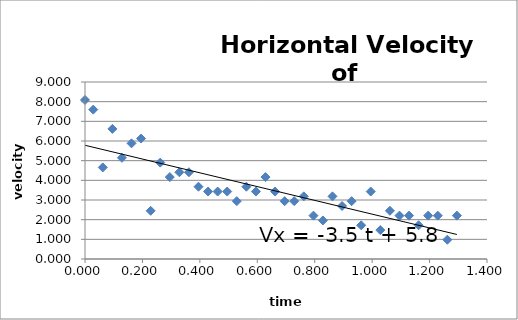
| Category | Series 0 |
|---|---|
| 0.0 | 8.086 |
| 0.02871111100000001 | 7.596 |
| 0.062033333000000024 | 4.656 |
| 0.09537777800000002 | 6.616 |
| 0.12868888899999997 | 5.146 |
| 0.16204444399999995 | 5.881 |
| 0.19534444400000006 | 6.126 |
| 0.228677778 | 2.45 |
| 0.262 | 4.901 |
| 0.295322222 | 4.166 |
| 0.32865555599999996 | 4.411 |
| 0.361977778 | 4.411 |
| 0.3953 | 3.676 |
| 0.42863333300000006 | 3.431 |
| 0.46195555599999993 | 3.431 |
| 0.4952888889999998 | 3.431 |
| 0.528611111 | 2.94 |
| 0.5619333329999998 | 3.676 |
| 0.5952666670000002 | 3.431 |
| 0.628588889 | 4.166 |
| 0.6619222219999998 | 3.431 |
| 0.6952555559999998 | 2.94 |
| 0.728566667 | 2.94 |
| 0.7618888890000002 | 3.185 |
| 0.7955333329999998 | 2.205 |
| 0.8285444439999998 | 1.96 |
| 0.8618777779999998 | 3.185 |
| 0.8952111110000001 | 2.695 |
| 0.9285333329999998 | 2.94 |
| 0.9618555560000002 | 1.715 |
| 0.995188889 | 3.431 |
| 1.0285222219999999 | 1.47 |
| 1.061888889 | 2.45 |
| 1.095177778 | 2.205 |
| 1.128511111 | 2.205 |
| 1.1618333330000001 | 1.715 |
| 1.195155556 | 2.205 |
| 1.2284777779999998 | 2.205 |
| 1.261811111 | 0.98 |
| 1.2951333329999999 | 2.205 |